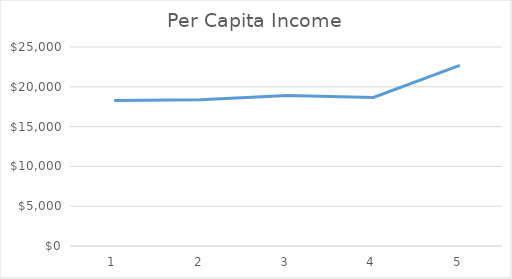
| Category | Series 0 |
|---|---|
| 0 | 18272.021 |
| 1 | 18364.79 |
| 2 | 18911.011 |
| 3 | 18666.121 |
| 4 | 22703.243 |